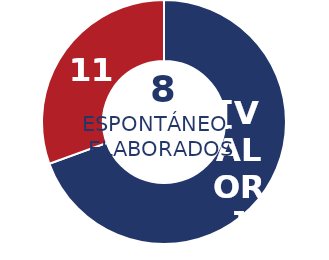
| Category | Series 0 |
|---|---|
| Física | 25 |
| Jurídica | 11 |